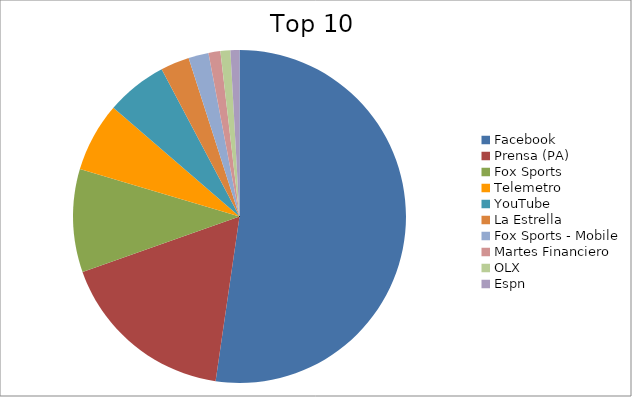
| Category | Series 0 |
|---|---|
| Facebook | 44.44 |
| Prensa (PA) | 14.7 |
| Fox Sports | 8.5 |
| Telemetro | 5.72 |
| YouTube | 5.04 |
| La Estrella | 2.38 |
| Fox Sports - Mobile | 1.66 |
| Martes Financiero | 0.98 |
| OLX | 0.82 |
| Espn | 0.74 |